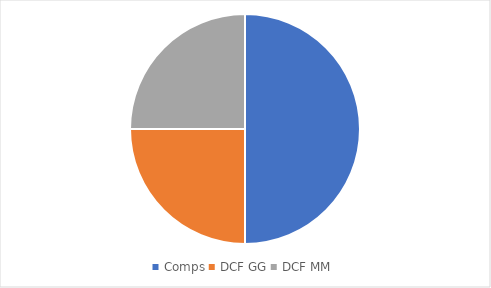
| Category | Series 0 | Series 1 |
|---|---|---|
| Comps | 0.5 | 45.679 |
| DCF GG | 0.25 | 26.364 |
| DCF MM | 0.25 | 23.592 |